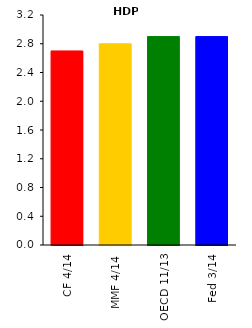
| Category | HDP |
|---|---|
| CF 4/14 | 2.7 |
| MMF 4/14 | 2.8 |
| OECD 11/13 | 2.9 |
| Fed 3/14 | 2.9 |